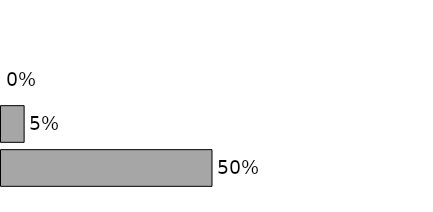
| Category | Series 0 |
|---|---|
| Fixed | 0.5 |
| Ops | 0.055 |
| SP | 0 |